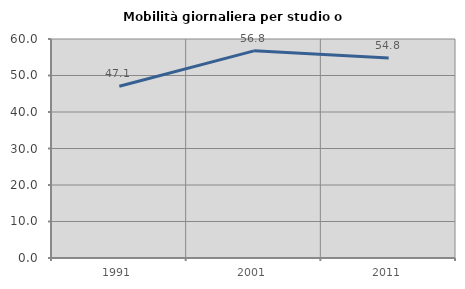
| Category | Mobilità giornaliera per studio o lavoro |
|---|---|
| 1991.0 | 47.067 |
| 2001.0 | 56.752 |
| 2011.0 | 54.816 |